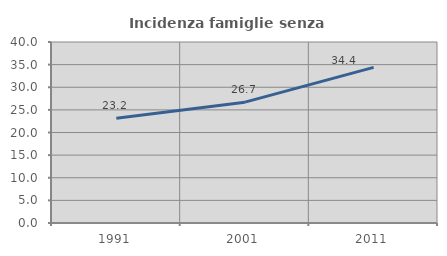
| Category | Incidenza famiglie senza nuclei |
|---|---|
| 1991.0 | 23.171 |
| 2001.0 | 26.707 |
| 2011.0 | 34.389 |